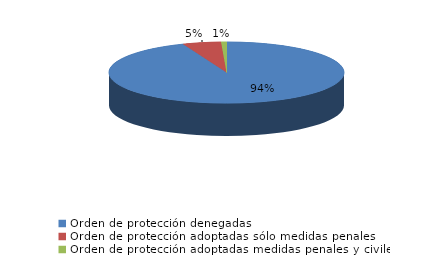
| Category | Series 0 |
|---|---|
| Orden de protección denegadas | 2284 |
| Orden de protección adoptadas sólo medidas penales | 128 |
| Orden de protección adoptadas medidas penales y civiles | 18 |